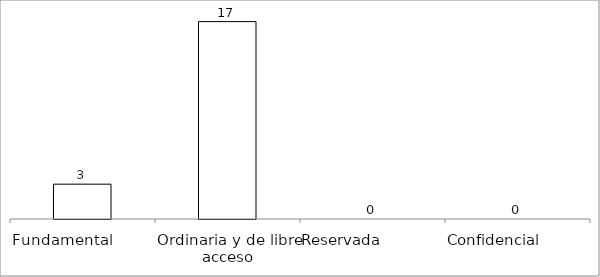
| Category | Series 0 |
|---|---|
| Fundamental         | 3 |
| Ordinaria y de libre acceso | 17 |
| Reservada               | 0 |
| Confidencial             | 0 |